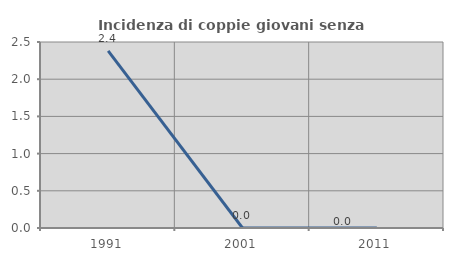
| Category | Incidenza di coppie giovani senza figli |
|---|---|
| 1991.0 | 2.381 |
| 2001.0 | 0 |
| 2011.0 | 0 |